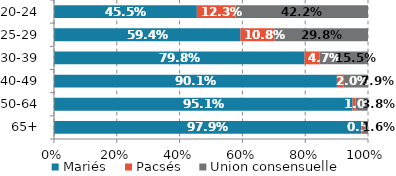
| Category | Mariés | Pacsés | Union consensuelle |
|---|---|---|---|
| 65+ | 0.979 | 0.005 | 0.016 |
| 50-64 | 0.951 | 0.01 | 0.038 |
| 40-49 | 0.901 | 0.02 | 0.079 |
| 30-39 | 0.798 | 0.047 | 0.155 |
| 25-29 | 0.594 | 0.108 | 0.298 |
| 20-24 | 0.455 | 0.123 | 0.422 |